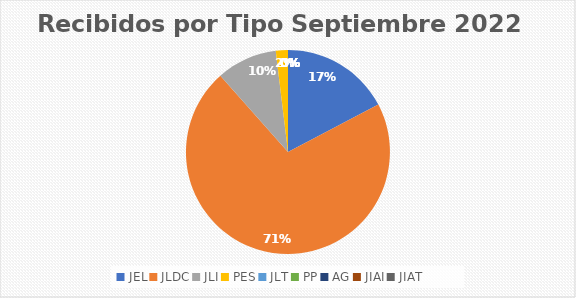
| Category | Series 0 |
|---|---|
| JEL | 9 |
| JLDC | 37 |
| JLI | 5 |
| PES | 1 |
| JLT | 0 |
| PP | 0 |
| AG | 0 |
| JIAI | 0 |
| JIAT | 0 |